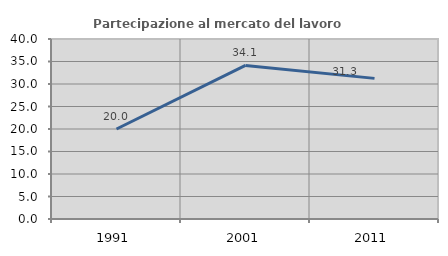
| Category | Partecipazione al mercato del lavoro  femminile |
|---|---|
| 1991.0 | 20 |
| 2001.0 | 34.127 |
| 2011.0 | 31.25 |